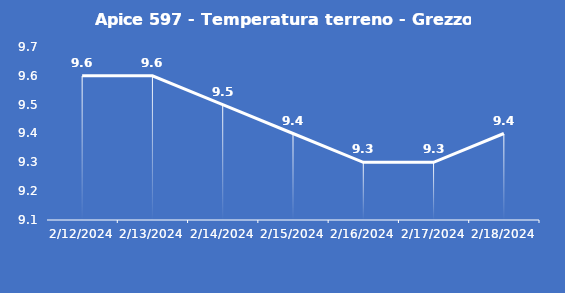
| Category | Apice 597 - Temperatura terreno - Grezzo (°C) |
|---|---|
| 2/12/24 | 9.6 |
| 2/13/24 | 9.6 |
| 2/14/24 | 9.5 |
| 2/15/24 | 9.4 |
| 2/16/24 | 9.3 |
| 2/17/24 | 9.3 |
| 2/18/24 | 9.4 |